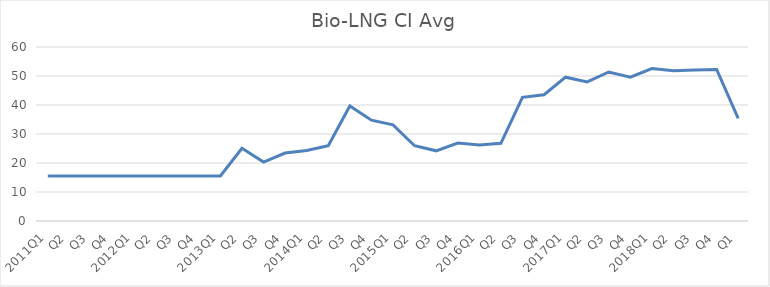
| Category | Bio-LNG CI Avg |
|---|---|
| 2011Q1 | 15.56 |
| Q2 | 15.56 |
| Q3 | 15.56 |
| Q4 | 15.56 |
| 2012Q1 | 15.56 |
| Q2 | 15.56 |
| Q3 | 15.56 |
| Q4 | 15.56 |
| 2013Q1 | 15.56 |
| Q2 | 25.06 |
| Q3 | 20.32 |
| Q4 | 23.42 |
| 2014Q1 | 24.31 |
| Q2 | 26 |
| Q3 | 39.65 |
| Q4 | 34.76 |
| 2015Q1 | 33.17 |
| Q2 | 25.96 |
| Q3 | 24.2 |
| Q4 | 26.86 |
| 2016Q1 | 26.17 |
| Q2 | 26.78 |
| Q3 | 42.66 |
| Q4 | 43.55 |
| 2017Q1 | 49.59 |
| Q2 | 47.97 |
| Q3 | 51.38 |
| Q4 | 49.57 |
| 2018Q1 | 52.59 |
| Q2 | 51.78 |
| Q3 | 52.1 |
| Q4 | 52.25 |
| Q1 | 35.37 |